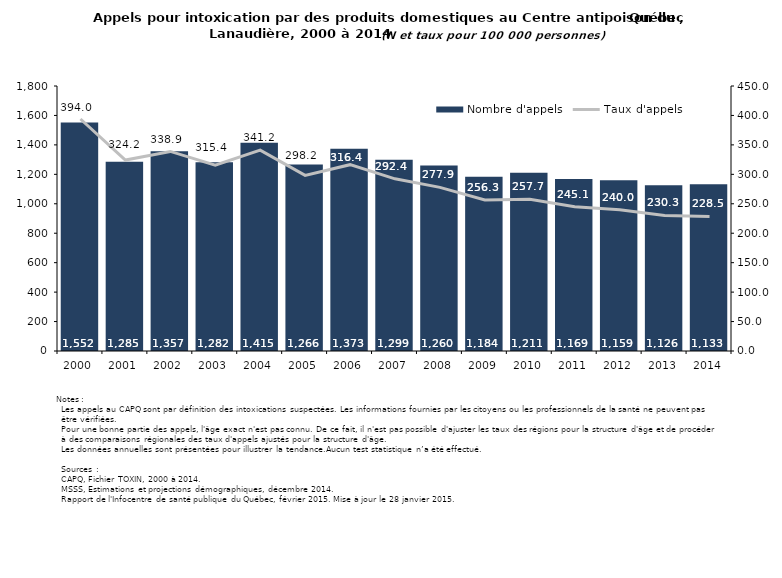
| Category | Nombre d'appels |
|---|---|
| 2000.0 | 1552 |
| 2001.0 | 1285 |
| 2002.0 | 1357 |
| 2003.0 | 1282 |
| 2004.0 | 1415 |
| 2005.0 | 1266 |
| 2006.0 | 1373 |
| 2007.0 | 1299 |
| 2008.0 | 1260 |
| 2009.0 | 1184 |
| 2010.0 | 1211 |
| 2011.0 | 1169 |
| 2012.0 | 1159 |
| 2013.0 | 1126 |
| 2014.0 | 1133 |